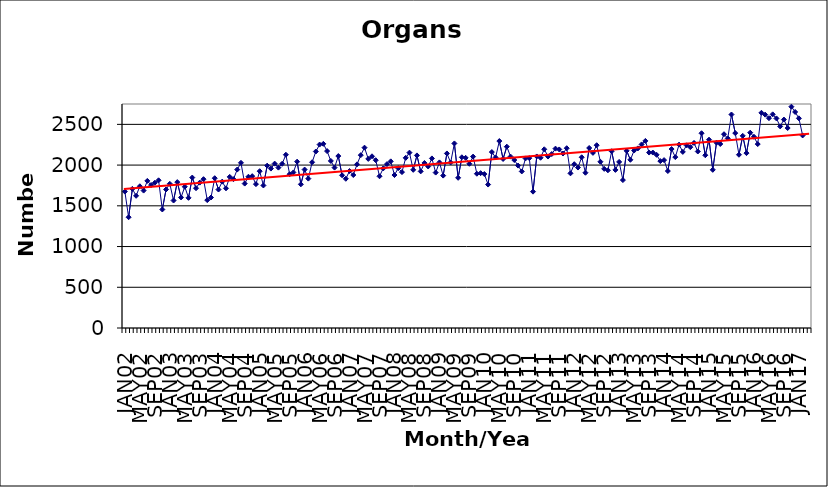
| Category | Series 0 |
|---|---|
| JAN02 | 1675 |
| FEB02 | 1360 |
| MAR02 | 1708 |
| APR02 | 1623 |
| MAY02 | 1740 |
| JUN02 | 1687 |
| JUL02 | 1806 |
| AUG02 | 1755 |
| SEP02 | 1783 |
| OCT02 | 1813 |
| NOV02 | 1455 |
| DEC02 | 1701 |
| JAN03 | 1770 |
| FEB03 | 1565 |
| MAR03 | 1791 |
| APR03 | 1603 |
| MAY03 | 1734 |
| JUN03 | 1598 |
| JUL03 | 1847 |
| AUG03 | 1716 |
| SEP03 | 1785 |
| OCT03 | 1827 |
| NOV03 | 1570 |
| DEC03 | 1602 |
| JAN04 | 1839 |
| FEB04 | 1700 |
| MAR04 | 1797 |
| APR04 | 1715 |
| MAY04 | 1855 |
| JUN04 | 1827 |
| JUL04 | 1945 |
| AUG04 | 2028 |
| SEP04 | 1773 |
| OCT04 | 1857 |
| NOV04 | 1864 |
| DEC04 | 1766 |
| JAN05 | 1925 |
| FEB05 | 1750 |
| MAR05 | 1993 |
| APR05 | 1957 |
| MAY05 | 2018 |
| JUN05 | 1969 |
| JUL05 | 2016 |
| AUG05 | 2127 |
| SEP05 | 1888 |
| OCT05 | 1910 |
| NOV05 | 2042 |
| DEC05 | 1764 |
| JAN06 | 1945 |
| FEB06 | 1834 |
| MAR06 | 2035 |
| APR06 | 2167 |
| MAY06 | 2252 |
| JUN06 | 2261 |
| JUL06 | 2172 |
| AUG06 | 2051 |
| SEP06 | 1969 |
| OCT06 | 2111 |
| NOV06 | 1875 |
| DEC06 | 1832 |
| JAN07 | 1927 |
| FEB07 | 1878 |
| MAR07 | 2009 |
| APR07 | 2122 |
| MAY07 | 2214 |
| JUN07 | 2076 |
| JUL07 | 2108 |
| AUG07 | 2060 |
| SEP07 | 1863 |
| OCT07 | 1959 |
| NOV07 | 2012 |
| DEC07 | 2046 |
| JAN08 | 1878 |
| FEB08 | 1962 |
| MAR08 | 1914 |
| APR08 | 2089 |
| MAY08 | 2153 |
| JUN08 | 1942 |
| JUL08 | 2119 |
| AUG08 | 1923 |
| SEP08 | 2026 |
| OCT08 | 1983 |
| NOV08 | 2082 |
| DEC08 | 1908 |
| JAN09 | 2033 |
| FEB09 | 1871 |
| MAR09 | 2143 |
| APR09 | 2032 |
| MAY09 | 2266 |
| JUN09 | 1844 |
| JUL09 | 2096 |
| AUG09 | 2089 |
| SEP09 | 2016 |
| OCT09 | 2104 |
| NOV09 | 1894 |
| DEC09 | 1901 |
| JAN10 | 1890 |
| FEB10 | 1761 |
| MAR10 | 2160 |
| APR10 | 2094 |
| MAY10 | 2295 |
| JUN10 | 2075 |
| JUL10 | 2226 |
| AUG10 | 2104 |
| SEP10 | 2062 |
| OCT10 | 1994 |
| NOV10 | 1922 |
| DEC10 | 2082 |
| JAN11 | 2085 |
| FEB11 | 1674 |
| MAR11 | 2106 |
| APR11 | 2090 |
| MAY11 | 2194 |
| JUN11 | 2105 |
| JUL11 | 2136 |
| AUG11 | 2202 |
| SEP11 | 2192 |
| OCT11 | 2142 |
| NOV11 | 2207 |
| DEC11 | 1899 |
| JAN12 | 2011 |
| FEB12 | 1970 |
| MAR12 | 2096 |
| APR12 | 1906 |
| MAY12 | 2210 |
| JUN12 | 2150 |
| JUL12 | 2244 |
| AUG12 | 2041 |
| SEP12 | 1954 |
| OCT12 | 1936 |
| NOV12 | 2170 |
| DEC12 | 1941 |
| JAN13 | 2039 |
| FEB13 | 1816 |
| MAR13 | 2175 |
| APR13 | 2065 |
| MAY13 | 2179 |
| JUN13 | 2205 |
| JUL13 | 2254 |
| AUG13 | 2297 |
| SEP13 | 2154 |
| OCT13 | 2154 |
| NOV13 | 2126 |
| DEC13 | 2049 |
| JAN14 | 2061 |
| FEB14 | 1927 |
| MAR14 | 2197 |
| APR14 | 2098 |
| MAY14 | 2251 |
| JUN14 | 2162 |
| JUL14 | 2243 |
| AUG14 | 2220 |
| SEP14 | 2272 |
| OCT14 | 2167 |
| NOV14 | 2391 |
| DEC14 | 2121 |
| JAN15 | 2312 |
| FEB15 | 1942 |
| MAR15 | 2275 |
| APR15 | 2259 |
| MAY15 | 2379 |
| JUN15 | 2328 |
| JUL15 | 2621 |
| AUG15 | 2393 |
| SEP15 | 2127 |
| OCT15 | 2359 |
| NOV15 | 2147 |
| DEC15 | 2398 |
| JAN16 | 2348 |
| FEB16 | 2258 |
| MAR16 | 2642 |
| APR16 | 2619 |
| MAY16 | 2576 |
| JUN16 | 2623 |
| JUL16 | 2573 |
| AUG16 | 2475 |
| SEP16 | 2559 |
| OCT16 | 2455 |
| NOV16 | 2717 |
| DEC16 | 2652 |
| JAN17 | 2574 |
| FEB17 | 2364 |